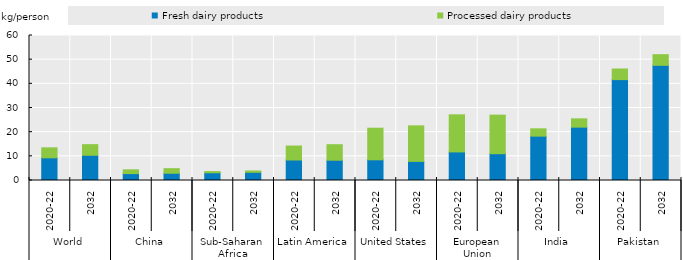
| Category | Fresh dairy products | Processed dairy products |
|---|---|---|
| 0 | 9.395 | 4.119 |
| 1 | 10.426 | 4.404 |
| 2 | 2.859 | 1.552 |
| 3 | 2.996 | 1.897 |
| 4 | 3.189 | 0.496 |
| 5 | 3.39 | 0.544 |
| 6 | 8.481 | 5.781 |
| 7 | 8.392 | 6.421 |
| 8 | 8.562 | 13.08 |
| 9 | 7.907 | 14.711 |
| 10 | 11.82 | 15.358 |
| 11 | 11.079 | 15.971 |
| 12 | 18.354 | 3.027 |
| 13 | 22.076 | 3.428 |
| 14 | 41.747 | 4.388 |
| 15 | 47.65 | 4.414 |